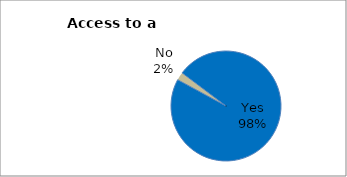
| Category | Series 0 |
|---|---|
| Yes | 97.647 |
| No | 2.353 |